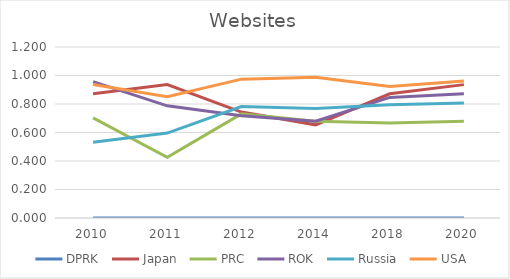
| Category | DPRK  | Japan  | PRC  | ROK  | Russia  | USA  |
|---|---|---|---|---|---|---|
| 2010.0 | 0 | 0.872 | 0.702 | 0.957 | 0.532 | 0.936 |
| 2011.0 | 0 | 0.936 | 0.426 | 0.787 | 0.596 | 0.851 |
| 2012.0 | 0 | 0.744 | 0.731 | 0.718 | 0.782 | 0.974 |
| 2014.0 | 0 | 0.654 | 0.679 | 0.679 | 0.769 | 0.987 |
| 2018.0 | 0 | 0.872 | 0.667 | 0.846 | 0.795 | 0.923 |
| 2020.0 | 0 | 0.936 | 0.679 | 0.872 | 0.808 | 0.962 |